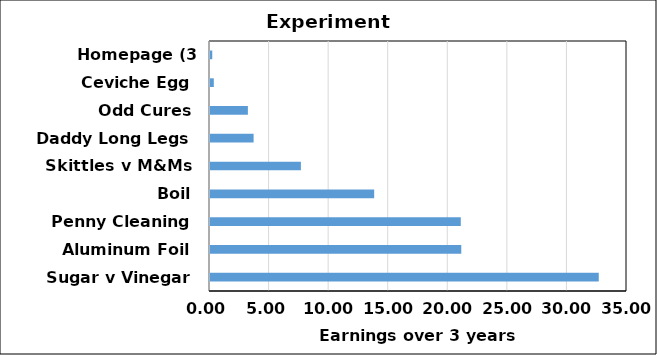
| Category | Series 0 |
|---|---|
| Sugar v Vinegar | 32.63 |
| Aluminum Foil | 21.09 |
| Penny Cleaning | 21.05 |
| Boil | 13.78 |
| Skittles v M&Ms | 7.63 |
| Daddy Long Legs | 3.66 |
| Odd Cures | 3.18 |
| Ceviche Egg | 0.32 |
| Homepage (3 months) | 0.19 |